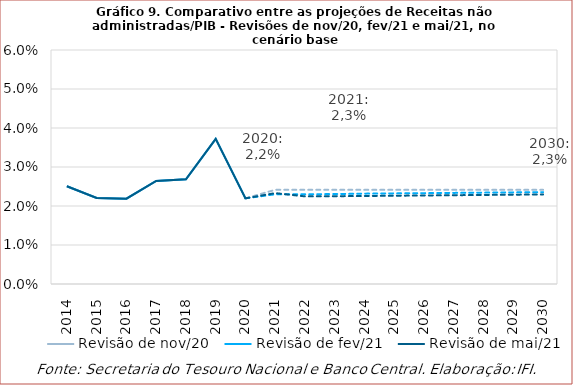
| Category | Revisão de nov/20 | Revisão de fev/21 | Revisão de mai/21 |
|---|---|---|---|
| 2014.0 | 0.025 | 0.025 | 0.025 |
| 2015.0 | 0.022 | 0.022 | 0.022 |
| 2016.0 | 0.022 | 0.022 | 0.022 |
| 2017.0 | 0.026 | 0.026 | 0.026 |
| 2018.0 | 0.027 | 0.027 | 0.027 |
| 2019.0 | 0.037 | 0.037 | 0.037 |
| 2020.0 | 0.022 | 0.022 | 0.022 |
| 2021.0 | 0.024 | 0.023 | 0.023 |
| 2022.0 | 0.024 | 0.023 | 0.022 |
| 2023.0 | 0.024 | 0.023 | 0.023 |
| 2024.0 | 0.024 | 0.023 | 0.023 |
| 2025.0 | 0.024 | 0.023 | 0.023 |
| 2026.0 | 0.024 | 0.023 | 0.023 |
| 2027.0 | 0.024 | 0.023 | 0.023 |
| 2028.0 | 0.024 | 0.023 | 0.023 |
| 2029.0 | 0.024 | 0.023 | 0.023 |
| 2030.0 | 0.024 | 0.024 | 0.023 |